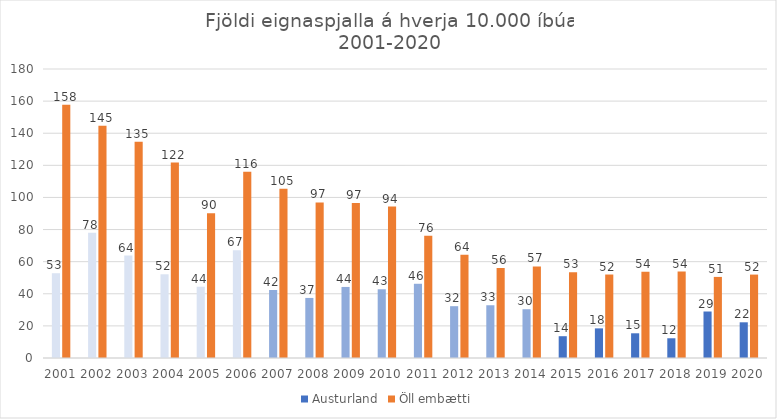
| Category | Austurland | Öll embætti |
|---|---|---|
| 2001.0 | 52.808 | 157.787 |
| 2002.0 | 77.979 | 144.664 |
| 2003.0 | 63.786 | 134.732 |
| 2004.0 | 52.14 | 121.721 |
| 2005.0 | 44.394 | 90.148 |
| 2006.0 | 67.104 | 115.964 |
| 2007.0 | 42.345 | 105.448 |
| 2008.0 | 37.407 | 96.909 |
| 2009.0 | 44.255 | 96.578 |
| 2010.0 | 42.802 | 94.327 |
| 2011.0 | 46.225 | 76.11 |
| 2012.0 | 32.271 | 64.294 |
| 2013.0 | 32.855 | 56.121 |
| 2014.0 | 30.376 | 57.028 |
| 2015.0 | 13.574 | 53.414 |
| 2016.0 | 18.455 | 51.992 |
| 2017.0 | 15.388 | 53.728 |
| 2018.0 | 12.29 | 53.867 |
| 2019.0 | 28.96 | 50.504 |
| 2020.0 | 22.234 | 51.956 |